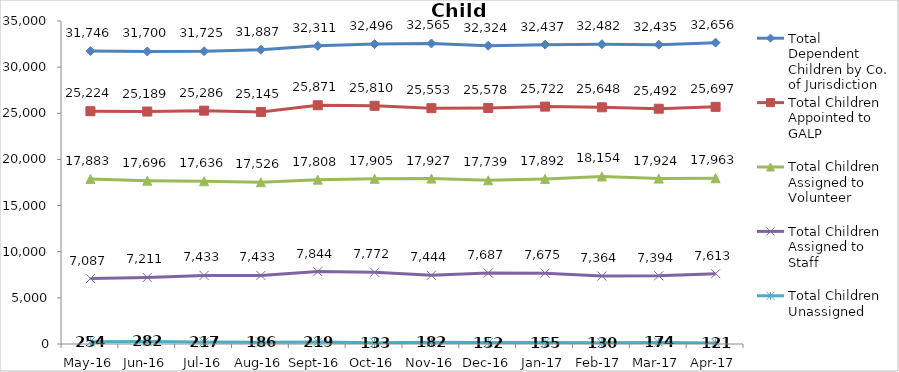
| Category | Total Dependent Children by Co. of Jurisdiction | Total Children Appointed to GALP | Total Children Assigned to Volunteer | Total Children Assigned to Staff | Total Children Unassigned |
|---|---|---|---|---|---|
| May-16 | 31746 | 25224 | 17883 | 7087 | 254 |
| Jun-16 | 31700 | 25189 | 17696 | 7211 | 282 |
| Jul-16 | 31725 | 25286 | 17636 | 7433 | 217 |
| Aug-16 | 31887 | 25145 | 17526 | 7433 | 186 |
| Sep-16 | 32311 | 25871 | 17808 | 7844 | 219 |
| Oct-16 | 32496 | 25810 | 17905 | 7772 | 133 |
| Nov-16 | 32565 | 25553 | 17927 | 7444 | 182 |
| Dec-16 | 32324 | 25578 | 17739 | 7687 | 152 |
| Jan-17 | 32437 | 25722 | 17892 | 7675 | 155 |
| Feb-17 | 32482 | 25648 | 18154 | 7364 | 130 |
| Mar-17 | 32435 | 25492 | 17924 | 7394 | 174 |
| Apr-17 | 32656 | 25697 | 17963 | 7613 | 121 |